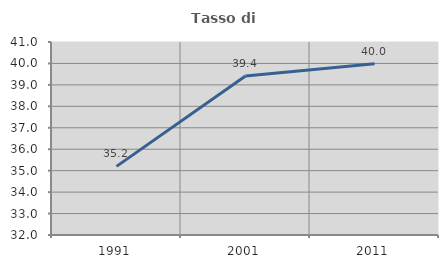
| Category | Tasso di occupazione   |
|---|---|
| 1991.0 | 35.201 |
| 2001.0 | 39.411 |
| 2011.0 | 39.985 |